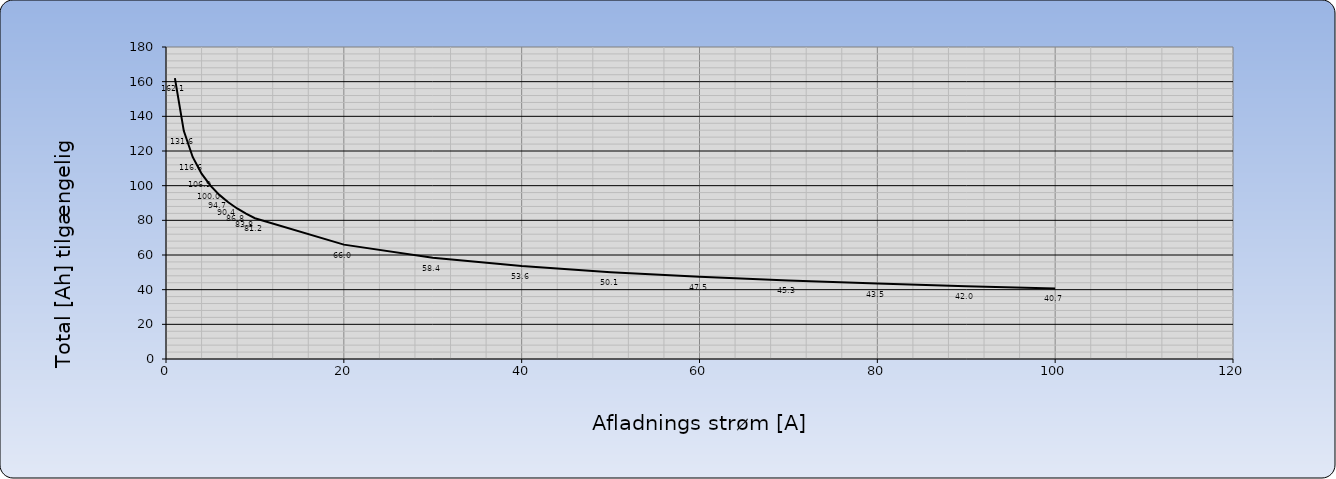
| Category | Series 0 |
|---|---|
| 1.0 | 162.066 |
| 2.0 | 131.638 |
| 3.0 | 116.561 |
| 4.0 | 106.923 |
| 5.0 | 100 |
| 6.0 | 94.677 |
| 7.0 | 90.399 |
| 8.0 | 86.849 |
| 9.0 | 83.834 |
| 10.0 | 81.225 |
| 20.0 | 65.975 |
| 30.0 | 58.419 |
| 40.0 | 53.589 |
| 50.0 | 50.119 |
| 60.0 | 47.451 |
| 70.0 | 45.307 |
| 80.0 | 43.528 |
| 90.0 | 42.016 |
| 100.0 | 40.709 |